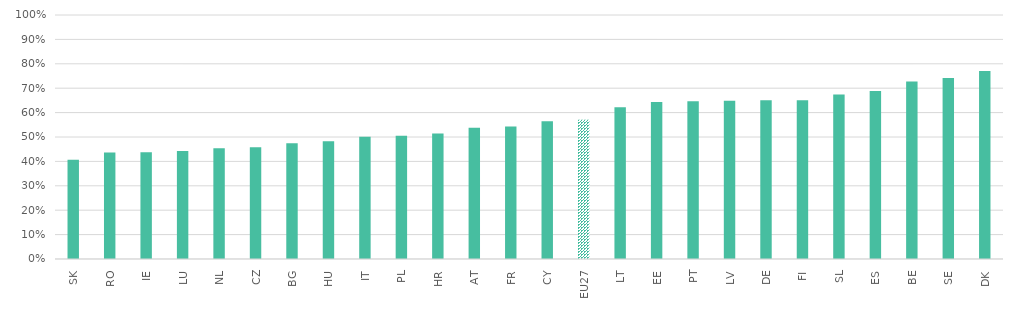
| Category | 0+ |
|---|---|
| SK | 0.407 |
| RO | 0.436 |
| IE | 0.437 |
| LU | 0.443 |
| NL | 0.454 |
| CZ | 0.458 |
| BG | 0.474 |
| HU | 0.483 |
| IT | 0.501 |
| PL | 0.505 |
| HR | 0.514 |
| AT | 0.538 |
| FR | 0.543 |
| CY | 0.565 |
| EU27 | 0.571 |
| LT | 0.622 |
| EE | 0.643 |
| PT | 0.647 |
| LV | 0.649 |
| DE | 0.651 |
| FI | 0.651 |
| SL | 0.674 |
| ES | 0.689 |
| BE | 0.727 |
| SE | 0.742 |
| DK | 0.771 |